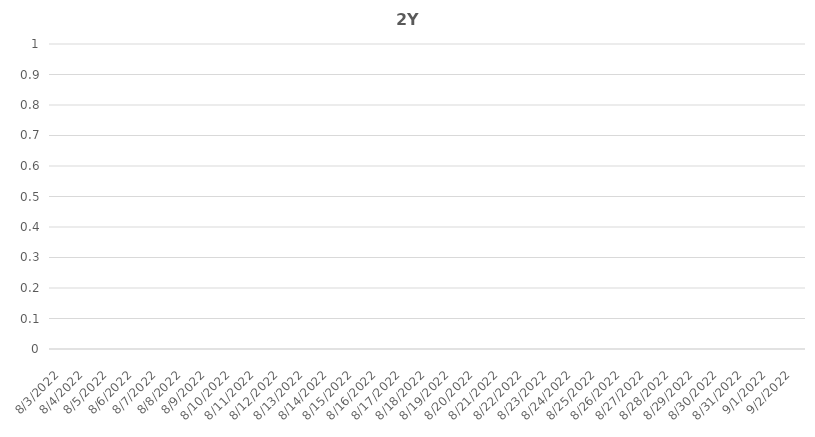
| Category | Series 0 |
|---|---|
| 8/3/22 | 0 |
| 8/4/22 | 0 |
| 8/5/22 | 0 |
| 8/8/22 | 0 |
| 8/9/22 | 0 |
| 8/10/22 | 0 |
| 8/11/22 | 0 |
| 8/12/22 | 0 |
| 8/15/22 | 0 |
| 8/16/22 | 0 |
| 8/17/22 | 0 |
| 8/18/22 | 0 |
| 8/19/22 | 0 |
| 8/22/22 | 0 |
| 8/23/22 | 0 |
| 8/24/22 | 0 |
| 8/25/22 | 0 |
| 8/26/22 | 0 |
| 8/29/22 | 0 |
| 8/30/22 | 0 |
| 8/31/22 | 0 |
| 9/1/22 | 0 |
| 9/2/22 | 0 |